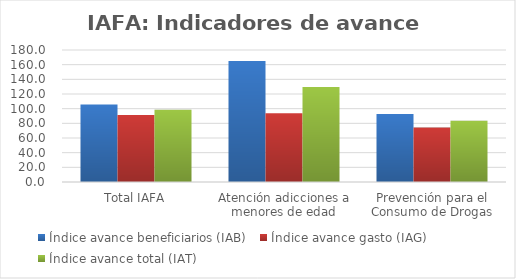
| Category | Índice avance beneficiarios (IAB)  | Índice avance gasto (IAG) | Índice avance total (IAT)  |
|---|---|---|---|
| Total IAFA | 105.704 | 91.28 | 98.492 |
| Atención adicciones a menores de edad | 165.038 | 93.907 | 129.473 |
| Prevención para el Consumo de Drogas | 92.83 | 74.264 | 83.547 |